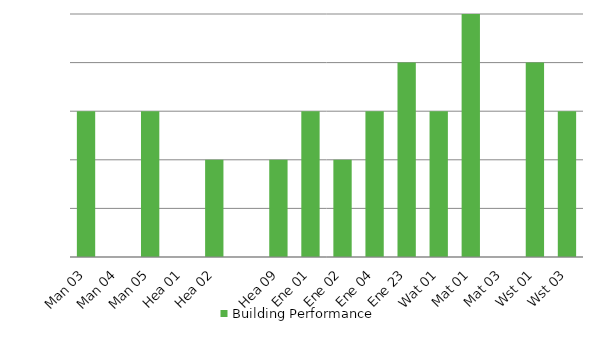
| Category | Building Performance |
|---|---|
| Man 03 | 3 |
| Man 04 | 0 |
| Man 05 | 3 |
| Hea 01 | 0 |
| Hea 02 | 2 |
|  | 0 |
| Hea 09 | 2 |
| Ene 01 | 3 |
| Ene 02 | 2 |
| Ene 04 | 3 |
| Ene 23 | 4 |
| Wat 01 | 3 |
| Mat 01 | 5 |
| Mat 03 | 0 |
| Wst 01 | 4 |
| Wst 03 | 3 |